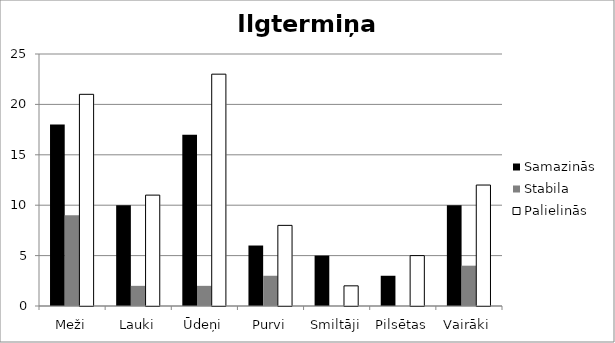
| Category | Samazinās | Stabila | Palielinās |
|---|---|---|---|
| Meži | 18 | 9 | 21 |
| Lauki | 10 | 2 | 11 |
| Ūdeņi | 17 | 2 | 23 |
| Purvi | 6 | 3 | 8 |
| Smiltāji | 5 | 0 | 2 |
| Pilsētas | 3 | 0 | 5 |
| Vairāki | 10 | 4 | 12 |